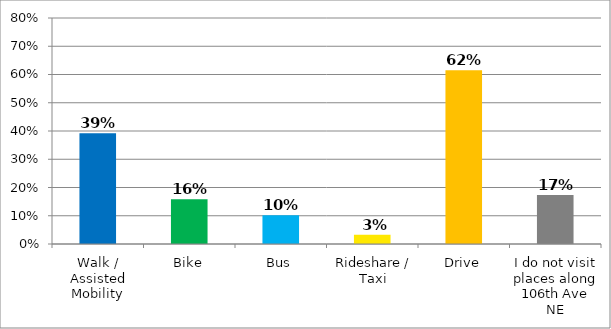
| Category | Responses |
|---|---|
| Walk / Assisted Mobility | 0.392 |
| Bike | 0.159 |
| Bus | 0.102 |
| Rideshare / Taxi | 0.033 |
| Drive | 0.615 |
| I do not visit places along 106th Ave NE | 0.174 |